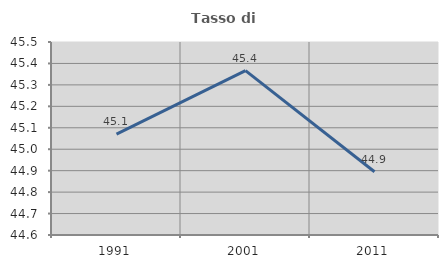
| Category | Tasso di occupazione   |
|---|---|
| 1991.0 | 45.07 |
| 2001.0 | 45.367 |
| 2011.0 | 44.895 |